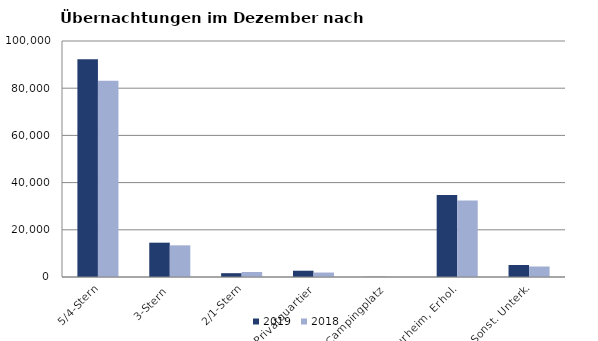
| Category | 2019 | 2018 |
|---|---|---|
| 5/4-Stern | 92282 | 83124 |
| 3-Stern | 14545 | 13414 |
| 2/1-Stern | 1617 | 2128 |
| Privatquartier | 2662 | 1890 |
| Campingplatz | 49 | 16 |
| Kurheim, Erhol. | 34786 | 32397 |
| Sonst. Unterk. | 5090 | 4445 |